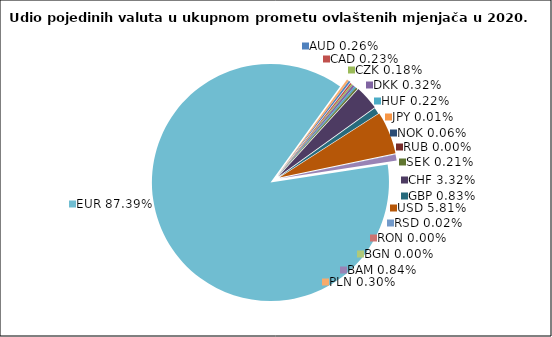
| Category | Series 0 |
|---|---|
| AUD | 0.261 |
| CAD | 0.227 |
| CZK | 0.185 |
| DKK | 0.318 |
| HUF | 0.216 |
| JPY | 0.006 |
| NOK | 0.061 |
| RUB | 0.001 |
| SEK | 0.213 |
| CHF | 3.321 |
| GBP | 0.829 |
| USD | 5.81 |
| RSD | 0.017 |
| RON | 0.001 |
| BGN | 0.001 |
| BAM | 0.844 |
| EUR | 87.394 |
| PLN | 0.296 |